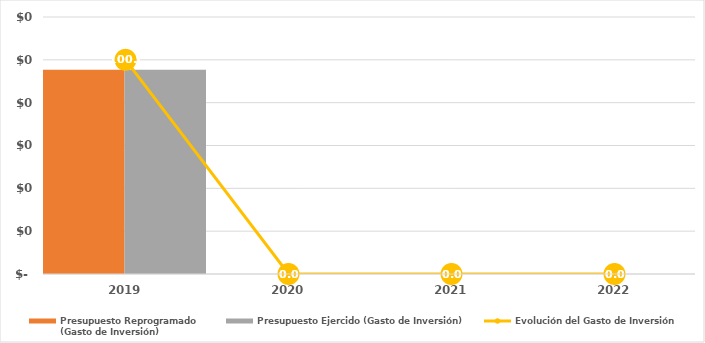
| Category | Presupuesto Reprogramado
(Gasto de Inversión) | Presupuesto Ejercido (Gasto de Inversión) |
|---|---|---|
| 2019.0 | 4.77 | 4.77 |
| 2020.0 | 0 | 0 |
| 2021.0 | 0 | 0 |
| 2022.0 | 0 | 0 |